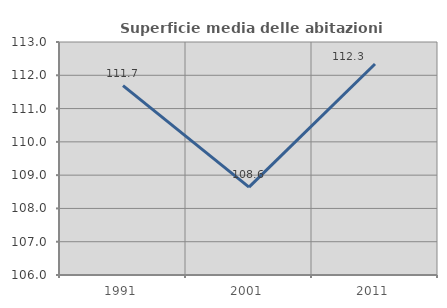
| Category | Superficie media delle abitazioni occupate |
|---|---|
| 1991.0 | 111.69 |
| 2001.0 | 108.641 |
| 2011.0 | 112.338 |